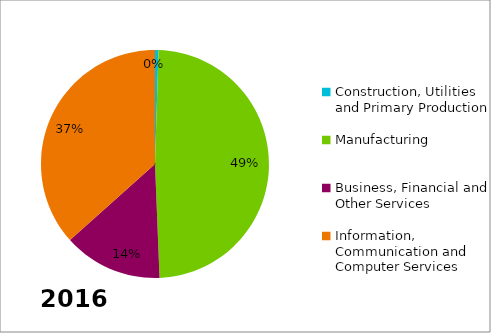
| Category | Series 0 |
|---|---|
| Construction, Utilities and Primary Production | 0.005 |
| Manufacturing | 0.489 |
| Business, Financial and Other Services | 0.14 |
| Information, Communication and Computer Services | 0.366 |